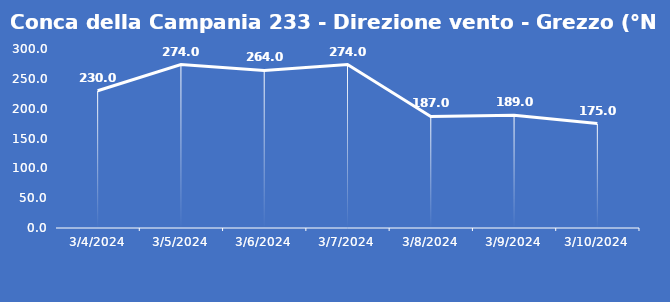
| Category | Conca della Campania 233 - Direzione vento - Grezzo (°N) |
|---|---|
| 3/4/24 | 230 |
| 3/5/24 | 274 |
| 3/6/24 | 264 |
| 3/7/24 | 274 |
| 3/8/24 | 187 |
| 3/9/24 | 189 |
| 3/10/24 | 175 |